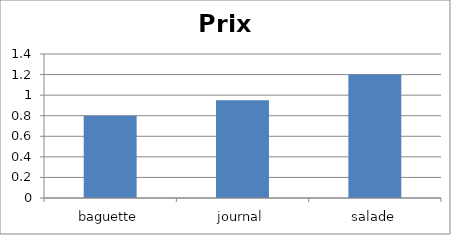
| Category | PrixUnitaire |
|---|---|
| baguette | 0.8 |
| journal | 0.95 |
| salade | 1.2 |